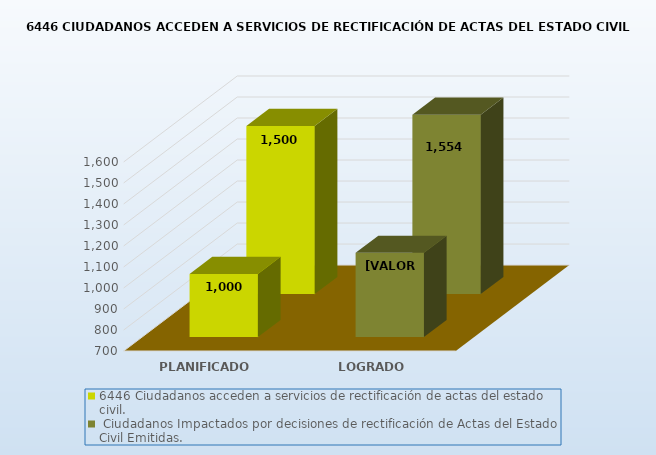
| Category | 6446 |
|---|---|
| PLANIFICADO | 1500 |
| LOGRADO | 1554 |